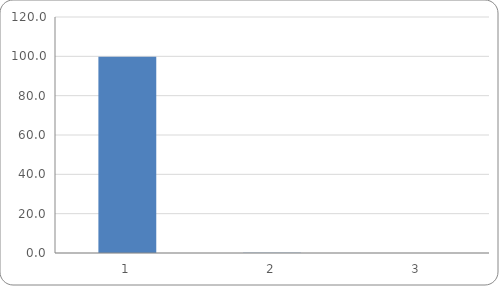
| Category | Component
Contribution
% |
|---|---|
| 0 | 99.822 |
| 1 | 0.177 |
| 2 | 0.001 |